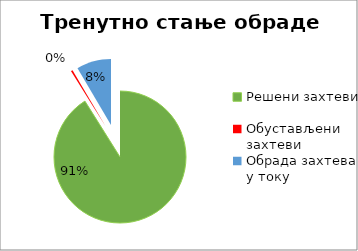
| Category | Series 0 |
|---|---|
| Решени захтеви | 24180 |
| Обустављени захтеви | 119 |
| Обрада захтева у току | 2249 |